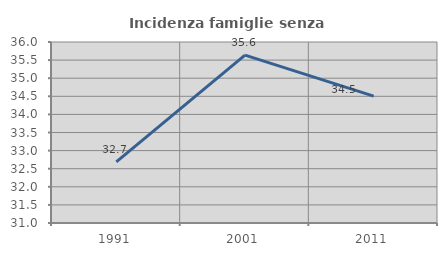
| Category | Incidenza famiglie senza nuclei |
|---|---|
| 1991.0 | 32.688 |
| 2001.0 | 35.636 |
| 2011.0 | 34.506 |